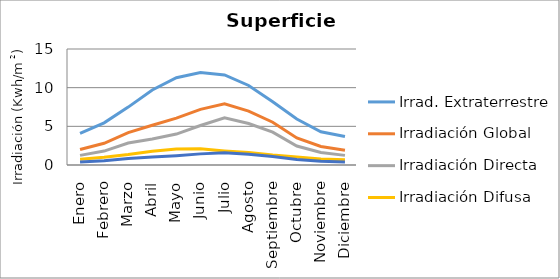
| Category | Irrad. Extraterrestre | Irradiación Global | Irradiación Directa | Irradiación Difusa | Irradiación Reflejada |
|---|---|---|---|---|---|
| Enero | 4.099 | 2 | 1.242 | 0.758 | 0.4 |
| Febrero | 5.457 | 2.806 | 1.804 | 1.002 | 0.561 |
| Marzo | 7.483 | 4.194 | 2.849 | 1.346 | 0.839 |
| Abril | 9.7 | 5.139 | 3.368 | 1.771 | 1.028 |
| Mayo | 11.288 | 6.056 | 4 | 2.055 | 1.211 |
| Junio | 11.966 | 7.194 | 5.107 | 2.087 | 1.439 |
| Julio | 11.647 | 7.917 | 6.104 | 1.813 | 1.583 |
| Agosto | 10.284 | 6.972 | 5.366 | 1.607 | 1.394 |
| Septiembre | 8.19 | 5.528 | 4.24 | 1.288 | 1.106 |
| Octubre | 5.94 | 3.5 | 2.453 | 1.047 | 0.7 |
| Noviembre | 4.3 | 2.389 | 1.613 | 0.776 | 0.478 |
| Diciembre | 3.675 | 1.917 | 1.244 | 0.673 | 0.383 |